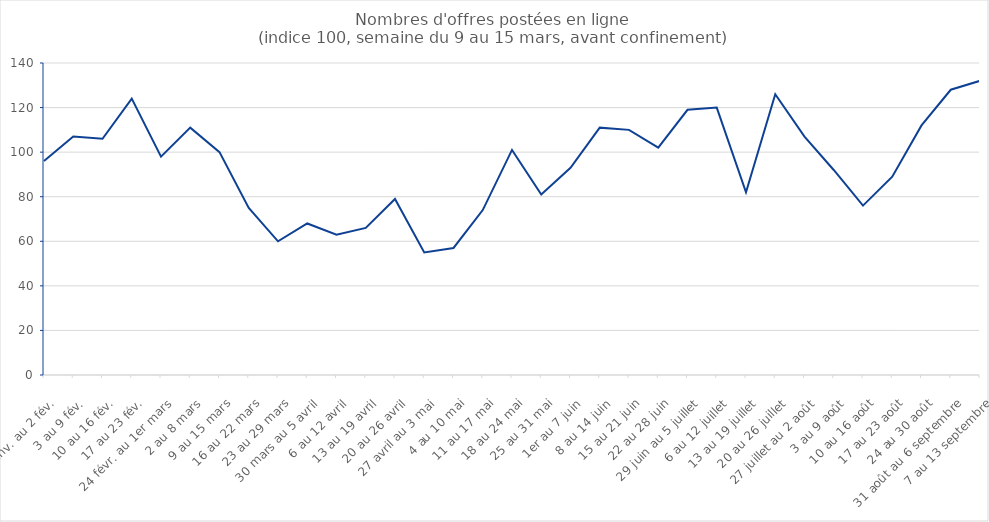
| Category | Series 0 |
|---|---|
| 27 janv. au 2 fév. | 96 |
| 3 au 9 fév. | 107 |
| 10 au 16 fév. | 106 |
| 17 au 23 fév. | 124 |
| 24 févr. au 1er mars | 98 |
| 2 au 8 mars | 111 |
| 9 au 15 mars | 100 |
| 16 au 22 mars | 75 |
| 23 au 29 mars | 60 |
| 30 mars au 5 avril | 68 |
| 6 au 12 avril | 63 |
| 13 au 19 avril | 66 |
| 20 au 26 avril | 79 |
| 27 avril au 3 mai | 55 |
| 4 au 10 mai | 57 |
| 11 au 17 mai | 74 |
| 18 au 24 mai | 101 |
| 25 au 31 mai | 81 |
| 1er au 7 juin | 93 |
| 8 au 14 juin | 111 |
| 15 au 21 juin | 110 |
| 22 au 28 juin | 102 |
| 29 juin au 5 juillet | 119 |
| 6 au 12 juillet | 120 |
| 13 au 19 juillet | 82 |
| 20 au 26 juillet | 126 |
| 27 juillet au 2 août | 107 |
| 3 au 9 août | 92 |
| 10 au 16 août | 76 |
| 17 au 23 août | 89 |
| 24 au 30 août | 112 |
| 31 août au 6 septembre | 128 |
| 7 au 13 septembre | 132 |